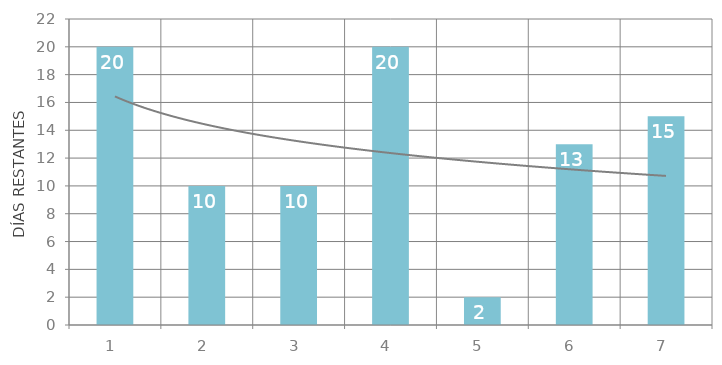
| Category | Total |
|---|---|
| 1  | 20 |
| 2  | 10 |
| 3  | 10 |
| 4  | 20 |
| 5  | 2 |
| 6  | 13 |
| 7  | 15 |